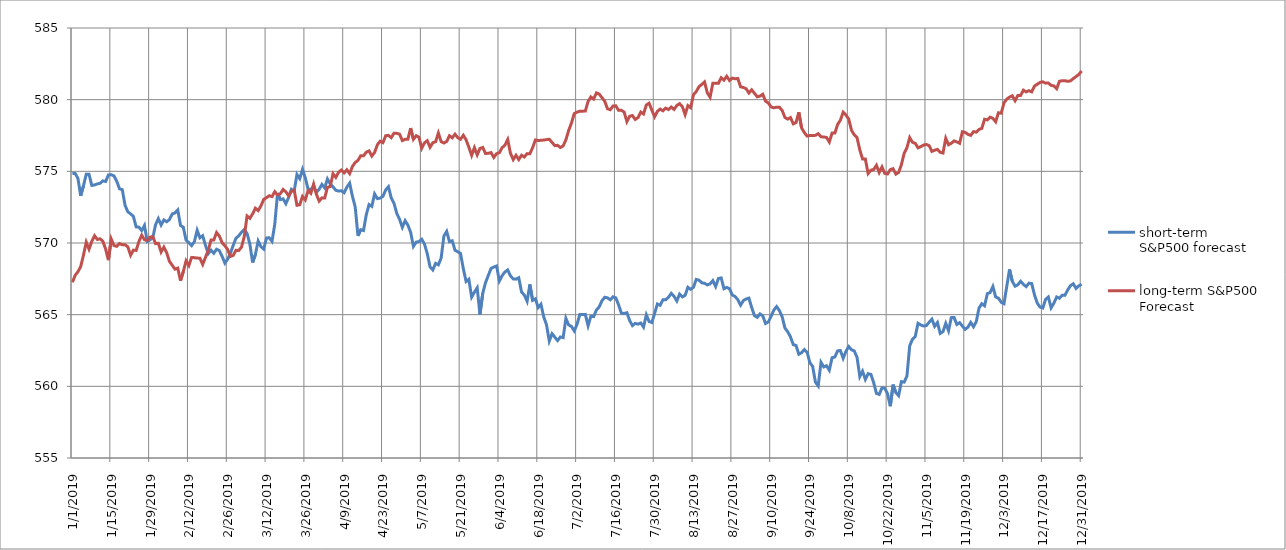
| Category | short-term S&P500 forecast | long-term S&P500 Forecast |
|---|---|---|
| 01/01/2019 | 574.843 | 567.258 |
| 02/01/2019 | 574.855 | 567.745 |
| 03/01/2019 | 574.51 | 567.992 |
| 04/01/2019 | 573.294 | 568.357 |
| 05/01/2019 | 573.999 | 569.151 |
| 06/01/2019 | 574.793 | 570.055 |
| 07/01/2019 | 574.801 | 569.568 |
| 08/01/2019 | 574.014 | 570.113 |
| 09/01/2019 | 574.052 | 570.506 |
| 10/01/2019 | 574.12 | 570.246 |
| 11/01/2019 | 574.166 | 570.294 |
| 12/01/2019 | 574.332 | 570.115 |
| 13/01/2019 | 574.295 | 569.568 |
| 14/01/2019 | 574.748 | 568.804 |
| 15/01/2019 | 574.766 | 570.281 |
| 16/01/2019 | 574.682 | 569.823 |
| 17/01/2019 | 574.309 | 569.767 |
| 18/01/2019 | 573.78 | 569.963 |
| 19/01/2019 | 573.721 | 569.873 |
| 20/01/2019 | 572.623 | 569.877 |
| 21/01/2019 | 572.177 | 569.733 |
| 22/01/2019 | 572.031 | 569.145 |
| 23/01/2019 | 571.857 | 569.501 |
| 24/01/2019 | 571.122 | 569.482 |
| 25/01/2019 | 571.106 | 570.106 |
| 26/01/2019 | 570.864 | 570.542 |
| 27/01/2019 | 571.225 | 570.226 |
| 28/01/2019 | 570.109 | 570.173 |
| 29/01/2019 | 570.221 | 570.404 |
| 30/01/2019 | 570.368 | 570.451 |
| 31/01/2019 | 571.277 | 569.958 |
| 01/02/2019 | 571.702 | 569.979 |
| 02/02/2019 | 571.255 | 569.373 |
| 03/02/2019 | 571.611 | 569.711 |
| 04/02/2019 | 571.482 | 569.327 |
| 05/02/2019 | 571.628 | 568.715 |
| 06/02/2019 | 572.025 | 568.455 |
| 07/02/2019 | 572.097 | 568.175 |
| 08/02/2019 | 572.307 | 568.247 |
| 09/02/2019 | 571.226 | 567.368 |
| 10/02/2019 | 571.102 | 568.005 |
| 11/02/2019 | 570.204 | 568.756 |
| 12/02/2019 | 570.023 | 568.426 |
| 13/02/2019 | 569.817 | 568.993 |
| 14/02/2019 | 570.092 | 568.977 |
| 15/02/2019 | 570.888 | 568.949 |
| 16/02/2019 | 570.364 | 568.939 |
| 17/02/2019 | 570.506 | 568.507 |
| 18/02/2019 | 569.833 | 569 |
| 19/02/2019 | 569.253 | 569.499 |
| 20/02/2019 | 569.498 | 570.209 |
| 21/02/2019 | 569.285 | 570.209 |
| 22/02/2019 | 569.563 | 570.728 |
| 23/02/2019 | 569.468 | 570.486 |
| 24/02/2019 | 569.065 | 570.019 |
| 25/02/2019 | 568.597 | 569.807 |
| 26/02/2019 | 568.875 | 569.55 |
| 27/02/2019 | 569.285 | 569.06 |
| 28/02/2019 | 569.83 | 569.135 |
| 01/03/2019 | 570.334 | 569.489 |
| 02/03/2019 | 570.501 | 569.474 |
| 03/03/2019 | 570.756 | 569.716 |
| 04/03/2019 | 570.942 | 570.459 |
| 05/03/2019 | 570.662 | 571.884 |
| 06/03/2019 | 569.945 | 571.721 |
| 07/03/2019 | 568.642 | 572.032 |
| 08/03/2019 | 569.188 | 572.426 |
| 09/03/2019 | 570.145 | 572.259 |
| 10/03/2019 | 569.746 | 572.59 |
| 11/03/2019 | 569.575 | 573.037 |
| 12/03/2019 | 570.35 | 573.163 |
| 13/03/2019 | 570.365 | 573.299 |
| 14/03/2019 | 570.114 | 573.24 |
| 15/03/2019 | 571.318 | 573.581 |
| 16/03/2019 | 573.48 | 573.346 |
| 17/03/2019 | 573.026 | 573.437 |
| 18/03/2019 | 573.08 | 573.738 |
| 19/03/2019 | 572.741 | 573.563 |
| 20/03/2019 | 573.185 | 573.301 |
| 21/03/2019 | 573.751 | 573.595 |
| 22/03/2019 | 573.631 | 573.687 |
| 23/03/2019 | 574.781 | 572.63 |
| 24/03/2019 | 574.491 | 572.673 |
| 25/03/2019 | 575.13 | 573.247 |
| 26/03/2019 | 574.552 | 573.011 |
| 27/03/2019 | 573.767 | 573.658 |
| 28/03/2019 | 573.731 | 573.463 |
| 29/03/2019 | 573.936 | 574.109 |
| 30/03/2019 | 573.532 | 573.406 |
| 31/03/2019 | 573.747 | 572.923 |
| 01/04/2019 | 574.086 | 573.148 |
| 02/04/2019 | 573.843 | 573.135 |
| 03/04/2019 | 574.469 | 573.883 |
| 04/04/2019 | 574.123 | 573.941 |
| 05/04/2019 | 573.924 | 574.832 |
| 06/04/2019 | 573.678 | 574.576 |
| 07/04/2019 | 573.626 | 574.935 |
| 08/04/2019 | 573.643 | 575.093 |
| 09/04/2019 | 573.509 | 574.889 |
| 10/04/2019 | 573.905 | 575.108 |
| 11/04/2019 | 574.176 | 574.842 |
| 12/04/2019 | 573.256 | 575.339 |
| 13/04/2019 | 572.523 | 575.617 |
| 14/04/2019 | 570.5 | 575.764 |
| 15/04/2019 | 570.924 | 576.091 |
| 16/04/2019 | 570.87 | 576.085 |
| 17/04/2019 | 571.975 | 576.335 |
| 18/04/2019 | 572.683 | 576.429 |
| 19/04/2019 | 572.556 | 576.065 |
| 20/04/2019 | 573.425 | 576.318 |
| 21/04/2019 | 573.097 | 576.853 |
| 22/04/2019 | 573.134 | 577.1 |
| 23/04/2019 | 573.257 | 577.003 |
| 24/04/2019 | 573.704 | 577.486 |
| 25/04/2019 | 573.926 | 577.509 |
| 26/04/2019 | 573.145 | 577.349 |
| 27/04/2019 | 572.771 | 577.663 |
| 28/04/2019 | 572.065 | 577.653 |
| 29/04/2019 | 571.652 | 577.595 |
| 30/04/2019 | 571.094 | 577.143 |
| 01/05/2019 | 571.558 | 577.236 |
| 02/05/2019 | 571.25 | 577.236 |
| 03/05/2019 | 570.744 | 578.015 |
| 04/05/2019 | 569.764 | 577.233 |
| 05/05/2019 | 570.065 | 577.488 |
| 06/05/2019 | 570.096 | 577.382 |
| 07/05/2019 | 570.261 | 576.616 |
| 08/05/2019 | 569.921 | 576.99 |
| 09/05/2019 | 569.249 | 577.138 |
| 10/05/2019 | 568.333 | 576.679 |
| 11/05/2019 | 568.122 | 576.998 |
| 12/05/2019 | 568.578 | 577.064 |
| 13/05/2019 | 568.475 | 577.674 |
| 14/05/2019 | 568.949 | 577.073 |
| 15/05/2019 | 570.489 | 576.978 |
| 16/05/2019 | 570.809 | 577.083 |
| 17/05/2019 | 570.092 | 577.484 |
| 18/05/2019 | 570.155 | 577.337 |
| 19/05/2019 | 569.494 | 577.592 |
| 20/05/2019 | 569.388 | 577.345 |
| 21/05/2019 | 569.271 | 577.24 |
| 22/05/2019 | 568.207 | 577.517 |
| 23/05/2019 | 567.313 | 577.201 |
| 24/05/2019 | 567.467 | 576.676 |
| 25/05/2019 | 566.225 | 576.113 |
| 26/05/2019 | 566.567 | 576.654 |
| 27/05/2019 | 566.876 | 576.148 |
| 28/05/2019 | 565.009 | 576.595 |
| 29/05/2019 | 566.491 | 576.667 |
| 30/05/2019 | 567.229 | 576.25 |
| 31/05/2019 | 567.733 | 576.254 |
| 01/06/2019 | 568.227 | 576.31 |
| 02/06/2019 | 568.323 | 575.97 |
| 03/06/2019 | 568.397 | 576.235 |
| 04/06/2019 | 567.347 | 576.299 |
| 05/06/2019 | 567.723 | 576.653 |
| 06/06/2019 | 567.976 | 576.821 |
| 07/06/2019 | 568.122 | 577.22 |
| 08/06/2019 | 567.705 | 576.265 |
| 09/06/2019 | 567.494 | 575.817 |
| 10/06/2019 | 567.477 | 576.12 |
| 11/06/2019 | 567.576 | 575.822 |
| 12/06/2019 | 566.582 | 576.123 |
| 13/06/2019 | 566.367 | 576.001 |
| 14/06/2019 | 565.936 | 576.236 |
| 15/06/2019 | 567.109 | 576.227 |
| 16/06/2019 | 565.996 | 576.654 |
| 17/06/2019 | 566.106 | 577.188 |
| 18/06/2019 | 565.498 | 577.146 |
| 19/06/2019 | 565.726 | 577.167 |
| 20/06/2019 | 564.844 | 577.183 |
| 21/06/2019 | 564.297 | 577.212 |
| 22/06/2019 | 563.16 | 577.239 |
| 23/06/2019 | 563.671 | 577.016 |
| 24/06/2019 | 563.426 | 576.794 |
| 25/06/2019 | 563.195 | 576.814 |
| 26/06/2019 | 563.445 | 576.663 |
| 27/06/2019 | 563.398 | 576.775 |
| 28/06/2019 | 564.738 | 577.198 |
| 29/06/2019 | 564.282 | 577.858 |
| 30/06/2019 | 564.181 | 578.363 |
| 01/07/2019 | 563.867 | 579.031 |
| 02/07/2019 | 564.317 | 579.133 |
| 03/07/2019 | 565.008 | 579.197 |
| 04/07/2019 | 565.008 | 579.197 |
| 05/07/2019 | 565.017 | 579.205 |
| 06/07/2019 | 564.227 | 579.878 |
| 07/07/2019 | 564.89 | 580.191 |
| 08/07/2019 | 564.866 | 580.041 |
| 09/07/2019 | 565.324 | 580.473 |
| 10/07/2019 | 565.541 | 580.393 |
| 11/07/2019 | 565.97 | 580.142 |
| 12/07/2019 | 566.214 | 579.887 |
| 13/07/2019 | 566.174 | 579.363 |
| 14/07/2019 | 566.039 | 579.298 |
| 15/07/2019 | 566.247 | 579.56 |
| 16/07/2019 | 566.174 | 579.569 |
| 17/07/2019 | 565.688 | 579.253 |
| 18/07/2019 | 565.103 | 579.257 |
| 19/07/2019 | 565.083 | 579.139 |
| 20/07/2019 | 565.137 | 578.469 |
| 21/07/2019 | 564.585 | 578.845 |
| 22/07/2019 | 564.236 | 578.89 |
| 23/07/2019 | 564.394 | 578.618 |
| 24/07/2019 | 564.338 | 578.747 |
| 25/07/2019 | 564.419 | 579.136 |
| 26/07/2019 | 564.131 | 579.002 |
| 27/07/2019 | 564.99 | 579.629 |
| 28/07/2019 | 564.525 | 579.752 |
| 29/07/2019 | 564.454 | 579.263 |
| 30/07/2019 | 565.093 | 578.808 |
| 31/07/2019 | 565.747 | 579.189 |
| 01/08/2019 | 565.654 | 579.342 |
| 02/08/2019 | 566.042 | 579.223 |
| 03/08/2019 | 566.038 | 579.409 |
| 04/08/2019 | 566.218 | 579.312 |
| 05/08/2019 | 566.486 | 579.487 |
| 06/08/2019 | 566.282 | 579.32 |
| 07/08/2019 | 565.956 | 579.591 |
| 08/08/2019 | 566.435 | 579.719 |
| 09/08/2019 | 566.236 | 579.514 |
| 10/08/2019 | 566.349 | 578.955 |
| 11/08/2019 | 566.911 | 579.589 |
| 12/08/2019 | 566.767 | 579.442 |
| 13/08/2019 | 566.907 | 580.342 |
| 14/08/2019 | 567.46 | 580.563 |
| 15/08/2019 | 567.406 | 580.909 |
| 16/08/2019 | 567.224 | 581.063 |
| 17/08/2019 | 567.189 | 581.237 |
| 18/08/2019 | 567.075 | 580.476 |
| 19/08/2019 | 567.151 | 580.172 |
| 20/08/2019 | 567.378 | 581.143 |
| 21/08/2019 | 566.965 | 581.145 |
| 22/08/2019 | 567.521 | 581.137 |
| 23/08/2019 | 567.565 | 581.532 |
| 24/08/2019 | 566.812 | 581.364 |
| 25/08/2019 | 566.904 | 581.633 |
| 26/08/2019 | 566.812 | 581.339 |
| 27/08/2019 | 566.374 | 581.502 |
| 28/08/2019 | 566.272 | 581.462 |
| 29/08/2019 | 566.045 | 581.474 |
| 30/08/2019 | 565.662 | 580.899 |
| 31/08/2019 | 565.981 | 580.853 |
| 01/09/2019 | 566.096 | 580.76 |
| 02/09/2019 | 566.153 | 580.467 |
| 03/09/2019 | 565.505 | 580.687 |
| 04/09/2019 | 564.934 | 580.449 |
| 05/09/2019 | 564.811 | 580.2 |
| 06/09/2019 | 565.053 | 580.246 |
| 07/09/2019 | 564.91 | 580.378 |
| 08/09/2019 | 564.384 | 579.899 |
| 09/09/2019 | 564.493 | 579.77 |
| 10/09/2019 | 564.886 | 579.495 |
| 11/09/2019 | 565.324 | 579.432 |
| 12/09/2019 | 565.563 | 579.478 |
| 13/09/2019 | 565.285 | 579.476 |
| 14/09/2019 | 564.85 | 579.246 |
| 15/09/2019 | 564.068 | 578.756 |
| 16/09/2019 | 563.804 | 578.643 |
| 17/09/2019 | 563.452 | 578.753 |
| 18/09/2019 | 562.909 | 578.315 |
| 19/09/2019 | 562.85 | 578.402 |
| 20/09/2019 | 562.24 | 579.119 |
| 21/09/2019 | 562.348 | 578.027 |
| 22/09/2019 | 562.566 | 577.702 |
| 23/09/2019 | 562.377 | 577.456 |
| 24/09/2019 | 561.646 | 577.503 |
| 25/09/2019 | 561.385 | 577.502 |
| 26/09/2019 | 560.29 | 577.51 |
| 27/09/2019 | 560.027 | 577.629 |
| 28/09/2019 | 561.678 | 577.41 |
| 29/09/2019 | 561.354 | 577.398 |
| 30/09/2019 | 561.437 | 577.363 |
| 01/10/2019 | 561.124 | 577.045 |
| 02/10/2019 | 561.997 | 577.672 |
| 03/10/2019 | 562.047 | 577.668 |
| 04/10/2019 | 562.473 | 578.269 |
| 05/10/2019 | 562.498 | 578.569 |
| 06/10/2019 | 561.959 | 579.123 |
| 07/10/2019 | 562.442 | 578.925 |
| 08/10/2019 | 562.774 | 578.651 |
| 09/10/2019 | 562.555 | 577.866 |
| 10/10/2019 | 562.467 | 577.543 |
| 11/10/2019 | 562.026 | 577.354 |
| 12/10/2019 | 560.679 | 576.493 |
| 13/10/2019 | 561.053 | 575.86 |
| 14/10/2019 | 560.479 | 575.854 |
| 15/10/2019 | 560.88 | 574.843 |
| 16/10/2019 | 560.837 | 575.077 |
| 17/10/2019 | 560.255 | 575.126 |
| 18/10/2019 | 559.508 | 575.423 |
| 19/10/2019 | 559.436 | 574.915 |
| 20/10/2019 | 559.899 | 575.303 |
| 21/10/2019 | 559.864 | 574.858 |
| 22/10/2019 | 559.485 | 574.814 |
| 23/10/2019 | 558.612 | 575.118 |
| 24/10/2019 | 560.117 | 575.185 |
| 25/10/2019 | 559.568 | 574.805 |
| 26/10/2019 | 559.352 | 574.921 |
| 27/10/2019 | 560.324 | 575.462 |
| 28/10/2019 | 560.293 | 576.265 |
| 29/10/2019 | 560.719 | 576.65 |
| 30/10/2019 | 562.827 | 577.355 |
| 31/10/2019 | 563.289 | 577.027 |
| 01/11/2019 | 563.484 | 576.954 |
| 02/11/2019 | 564.399 | 576.639 |
| 03/11/2019 | 564.281 | 576.725 |
| 04/11/2019 | 564.208 | 576.832 |
| 05/11/2019 | 564.237 | 576.877 |
| 06/11/2019 | 564.472 | 576.796 |
| 07/11/2019 | 564.685 | 576.391 |
| 08/11/2019 | 564.185 | 576.474 |
| 09/11/2019 | 564.451 | 576.53 |
| 10/11/2019 | 563.693 | 576.325 |
| 11/11/2019 | 563.814 | 576.276 |
| 12/11/2019 | 564.395 | 577.305 |
| 13/11/2019 | 563.878 | 576.855 |
| 14/11/2019 | 564.793 | 576.957 |
| 15/11/2019 | 564.802 | 577.122 |
| 16/11/2019 | 564.318 | 577.052 |
| 17/11/2019 | 564.441 | 576.96 |
| 18/11/2019 | 564.202 | 577.763 |
| 19/11/2019 | 563.976 | 577.718 |
| 20/11/2019 | 564.128 | 577.583 |
| 21/11/2019 | 564.461 | 577.509 |
| 22/11/2019 | 564.159 | 577.768 |
| 23/11/2019 | 564.513 | 577.735 |
| 24/11/2019 | 565.46 | 577.922 |
| 25/11/2019 | 565.763 | 577.994 |
| 26/11/2019 | 565.618 | 578.634 |
| 27/11/2019 | 566.467 | 578.589 |
| 28/11/2019 | 566.541 | 578.774 |
| 29/11/2019 | 566.962 | 578.698 |
| 30/11/2019 | 566.238 | 578.454 |
| 01/12/2019 | 566.151 | 579.087 |
| 02/12/2019 | 565.867 | 579.055 |
| 03/12/2019 | 565.767 | 579.773 |
| 04/12/2019 | 566.964 | 580.039 |
| 05/12/2019 | 568.158 | 580.18 |
| 06/12/2019 | 567.324 | 580.269 |
| 07/12/2019 | 566.985 | 579.927 |
| 08/12/2019 | 567.089 | 580.297 |
| 09/12/2019 | 567.331 | 580.296 |
| 10/12/2019 | 567.116 | 580.662 |
| 11/12/2019 | 566.956 | 580.545 |
| 12/12/2019 | 567.196 | 580.625 |
| 13/12/2019 | 567.169 | 580.546 |
| 14/12/2019 | 566.386 | 580.945 |
| 15/12/2019 | 565.809 | 581.075 |
| 16/12/2019 | 565.531 | 581.203 |
| 17/12/2019 | 565.466 | 581.247 |
| 18/12/2019 | 566.063 | 581.153 |
| 19/12/2019 | 566.231 | 581.161 |
| 20/12/2019 | 565.477 | 581.001 |
| 21/12/2019 | 565.805 | 580.955 |
| 22/12/2019 | 566.235 | 580.762 |
| 23/12/2019 | 566.147 | 581.285 |
| 24/12/2019 | 566.356 | 581.321 |
| 25/12/2019 | 566.356 | 581.321 |
| 26/12/2019 | 566.734 | 581.278 |
| 27/12/2019 | 567.029 | 581.314 |
| 28/12/2019 | 567.154 | 581.472 |
| 29/12/2019 | 566.829 | 581.615 |
| 30/12/2019 | 567.014 | 581.761 |
| 31/12/2019 | 567.122 | 582 |